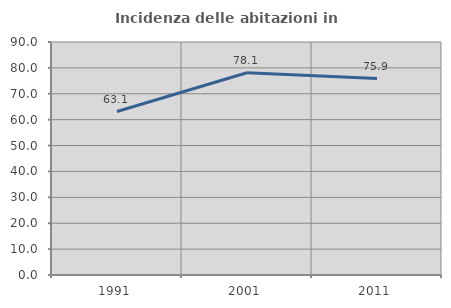
| Category | Incidenza delle abitazioni in proprietà  |
|---|---|
| 1991.0 | 63.136 |
| 2001.0 | 78.099 |
| 2011.0 | 75.889 |